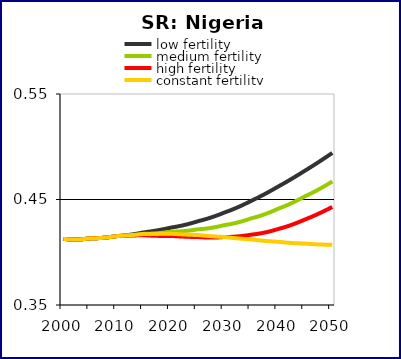
| Category | low fertility  | medium fertility  | high fertility | constant fertility |
|---|---|---|---|---|
| 2000.0 | 0.413 | 0.413 | 0.413 | 0.413 |
| 2001.0 | 0.412 | 0.412 | 0.412 | 0.412 |
| 2002.0 | 0.412 | 0.412 | 0.412 | 0.412 |
| 2003.0 | 0.412 | 0.412 | 0.412 | 0.412 |
| 2004.0 | 0.413 | 0.413 | 0.413 | 0.413 |
| 2005.0 | 0.413 | 0.413 | 0.413 | 0.413 |
| 2006.0 | 0.413 | 0.413 | 0.413 | 0.413 |
| 2007.0 | 0.414 | 0.414 | 0.414 | 0.414 |
| 2008.0 | 0.414 | 0.414 | 0.414 | 0.414 |
| 2009.0 | 0.415 | 0.415 | 0.415 | 0.415 |
| 2010.0 | 0.415 | 0.415 | 0.415 | 0.415 |
| 2011.0 | 0.416 | 0.416 | 0.416 | 0.416 |
| 2012.0 | 0.416 | 0.416 | 0.416 | 0.416 |
| 2013.0 | 0.417 | 0.416 | 0.416 | 0.416 |
| 2014.0 | 0.418 | 0.417 | 0.416 | 0.417 |
| 2015.0 | 0.419 | 0.418 | 0.416 | 0.417 |
| 2016.0 | 0.42 | 0.418 | 0.416 | 0.417 |
| 2017.0 | 0.42 | 0.418 | 0.416 | 0.417 |
| 2018.0 | 0.421 | 0.418 | 0.415 | 0.417 |
| 2019.0 | 0.422 | 0.419 | 0.415 | 0.417 |
| 2020.0 | 0.423 | 0.419 | 0.415 | 0.418 |
| 2021.0 | 0.424 | 0.42 | 0.415 | 0.417 |
| 2022.0 | 0.425 | 0.42 | 0.415 | 0.417 |
| 2023.0 | 0.426 | 0.42 | 0.415 | 0.417 |
| 2024.0 | 0.428 | 0.421 | 0.415 | 0.416 |
| 2025.0 | 0.429 | 0.422 | 0.414 | 0.416 |
| 2026.0 | 0.431 | 0.422 | 0.414 | 0.416 |
| 2027.0 | 0.432 | 0.423 | 0.414 | 0.415 |
| 2028.0 | 0.434 | 0.424 | 0.414 | 0.415 |
| 2029.0 | 0.436 | 0.425 | 0.414 | 0.415 |
| 2030.0 | 0.438 | 0.426 | 0.414 | 0.414 |
| 2031.0 | 0.44 | 0.427 | 0.415 | 0.414 |
| 2032.0 | 0.442 | 0.428 | 0.415 | 0.413 |
| 2033.0 | 0.444 | 0.429 | 0.415 | 0.413 |
| 2034.0 | 0.446 | 0.431 | 0.416 | 0.412 |
| 2035.0 | 0.449 | 0.432 | 0.417 | 0.412 |
| 2036.0 | 0.451 | 0.434 | 0.417 | 0.412 |
| 2037.0 | 0.454 | 0.435 | 0.418 | 0.411 |
| 2038.0 | 0.457 | 0.437 | 0.419 | 0.411 |
| 2039.0 | 0.46 | 0.439 | 0.421 | 0.41 |
| 2040.0 | 0.462 | 0.441 | 0.422 | 0.41 |
| 2041.0 | 0.465 | 0.443 | 0.424 | 0.409 |
| 2042.0 | 0.468 | 0.446 | 0.425 | 0.409 |
| 2043.0 | 0.471 | 0.448 | 0.427 | 0.409 |
| 2044.0 | 0.474 | 0.451 | 0.429 | 0.408 |
| 2045.0 | 0.478 | 0.453 | 0.431 | 0.408 |
| 2046.0 | 0.481 | 0.456 | 0.433 | 0.408 |
| 2047.0 | 0.484 | 0.458 | 0.436 | 0.408 |
| 2048.0 | 0.487 | 0.461 | 0.438 | 0.407 |
| 2049.0 | 0.491 | 0.464 | 0.44 | 0.407 |
| 2050.0 | 0.494 | 0.467 | 0.443 | 0.407 |